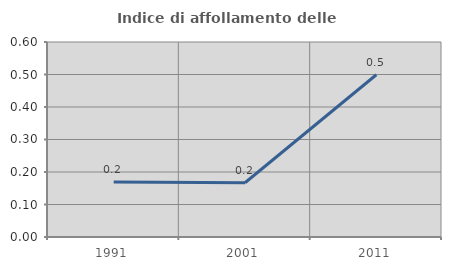
| Category | Indice di affollamento delle abitazioni  |
|---|---|
| 1991.0 | 0.169 |
| 2001.0 | 0.167 |
| 2011.0 | 0.499 |